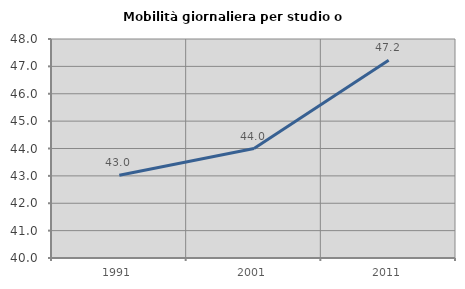
| Category | Mobilità giornaliera per studio o lavoro |
|---|---|
| 1991.0 | 43.023 |
| 2001.0 | 44 |
| 2011.0 | 47.222 |